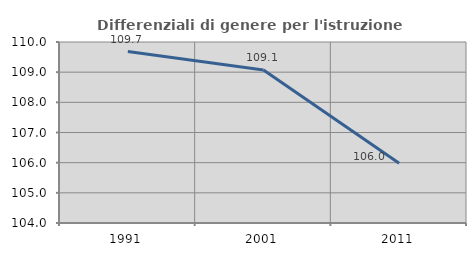
| Category | Differenziali di genere per l'istruzione superiore |
|---|---|
| 1991.0 | 109.682 |
| 2001.0 | 109.075 |
| 2011.0 | 105.984 |